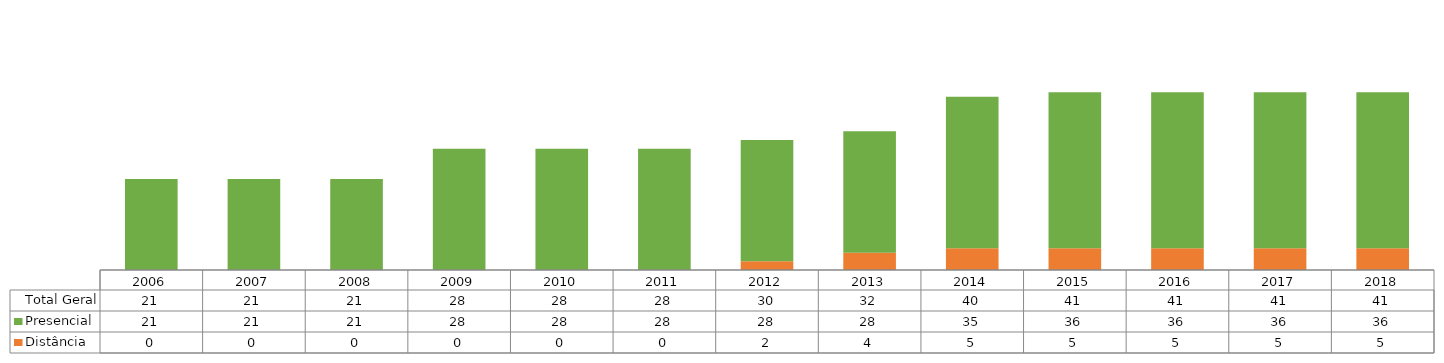
| Category | Distância | Presencial | Total Geral |
|---|---|---|---|
| 2006.0 | 0 | 21 | 21 |
| 2007.0 | 0 | 21 | 21 |
| 2008.0 | 0 | 21 | 21 |
| 2009.0 | 0 | 28 | 28 |
| 2010.0 | 0 | 28 | 28 |
| 2011.0 | 0 | 28 | 28 |
| 2012.0 | 2 | 28 | 30 |
| 2013.0 | 4 | 28 | 32 |
| 2014.0 | 5 | 35 | 40 |
| 2015.0 | 5 | 36 | 41 |
| 2016.0 | 5 | 36 | 41 |
| 2017.0 | 5 | 36 | 41 |
| 2018.0 | 5 | 36 | 41 |